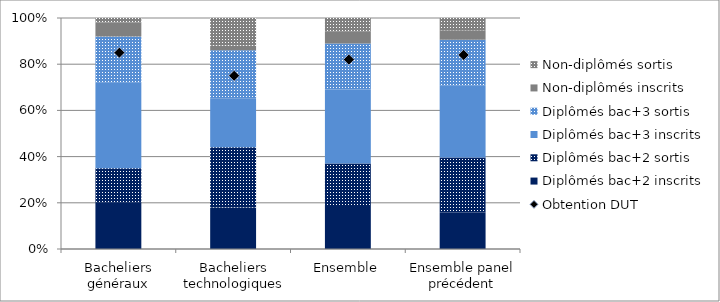
| Category | Diplômés bac+2 inscrits | Diplômés bac+2 sortis | Diplômés bac+3 inscrits | Diplômés bac+3 sortis | Non-diplômés inscrits | Non-diplômés sortis |
|---|---|---|---|---|---|---|
| Bacheliers généraux | 20 | 15 | 37 | 20 | 6 | 2 |
| Bacheliers technologiques | 18 | 26 | 21 | 21 | 2 | 12 |
| Ensemble | 19 | 18 | 32 | 20 | 5 | 6 |
| Ensemble panel précédent | 15.79 | 23.806 | 31.054 | 19.885 | 4.204 | 5.26 |